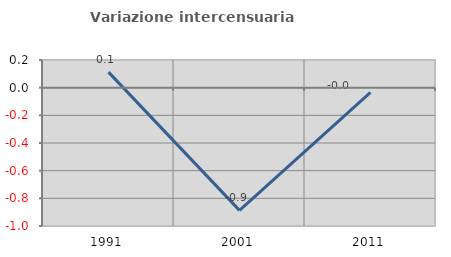
| Category | Variazione intercensuaria annua |
|---|---|
| 1991.0 | 0.112 |
| 2001.0 | -0.887 |
| 2011.0 | -0.034 |